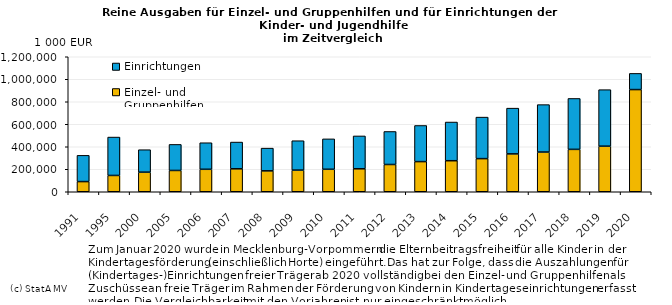
| Category | Einzel- und Gruppenhilfen | Einrichtungen |
|---|---|---|
| 0 | 90360 | 233292 |
| 1 | 144899 | 341324 |
| 2 | 173906 | 199851 |
| 3 | 189191 | 231504 |
| 4 | 199661 | 236113 |
| 5 | 203990 | 237757 |
| 6 | 185828 | 202073 |
| 7 | 192260 | 261355 |
| 8 | 199726 | 270369 |
| 9 | 204111 | 292060 |
| 10 | 242227 | 293602 |
| 11 | 268019 | 321049 |
| 12 | 275922 | 343890 |
| 13 | 294463 | 369024 |
| 14 | 336576 | 406740 |
| 15 | 352821 | 421805 |
| 16 | 376778 | 452531 |
| 17 | 405081 | 502343 |
| 18 | 908202 | 143868 |